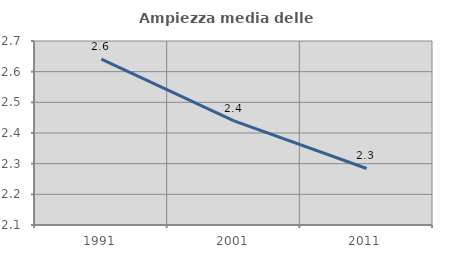
| Category | Ampiezza media delle famiglie |
|---|---|
| 1991.0 | 2.641 |
| 2001.0 | 2.44 |
| 2011.0 | 2.284 |